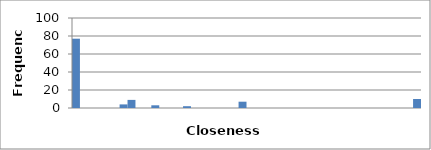
| Category | 77 |
|---|---|
| 0.0 | 77 |
| 0.023255813953488372 | 0 |
| 0.046511627906976744 | 0 |
| 0.06976744186046512 | 0 |
| 0.09302325581395349 | 0 |
| 0.11627906976744186 | 0 |
| 0.13953488372093023 | 4 |
| 0.16279069767441862 | 9 |
| 0.18604651162790697 | 0 |
| 0.20930232558139533 | 0 |
| 0.2325581395348837 | 3 |
| 0.25581395348837205 | 0 |
| 0.2790697674418604 | 0 |
| 0.30232558139534876 | 0 |
| 0.3255813953488371 | 2 |
| 0.3488372093023255 | 0 |
| 0.37209302325581384 | 0 |
| 0.3953488372093022 | 0 |
| 0.41860465116279055 | 0 |
| 0.4418604651162789 | 0 |
| 0.46511627906976727 | 0 |
| 0.4883720930232556 | 7 |
| 0.511627906976744 | 0 |
| 0.5348837209302324 | 0 |
| 0.5581395348837208 | 0 |
| 0.5813953488372092 | 0 |
| 0.6046511627906976 | 0 |
| 0.627906976744186 | 0 |
| 0.6511627906976745 | 0 |
| 0.6744186046511629 | 0 |
| 0.6976744186046513 | 0 |
| 0.7209302325581397 | 0 |
| 0.7441860465116281 | 0 |
| 0.7674418604651165 | 0 |
| 0.790697674418605 | 0 |
| 0.8139534883720934 | 0 |
| 0.8372093023255818 | 0 |
| 0.8604651162790702 | 0 |
| 0.8837209302325586 | 0 |
| 0.906976744186047 | 0 |
| 0.9302325581395354 | 0 |
| 0.9534883720930238 | 0 |
| 0.9767441860465123 | 0 |
| 1.0 | 10 |